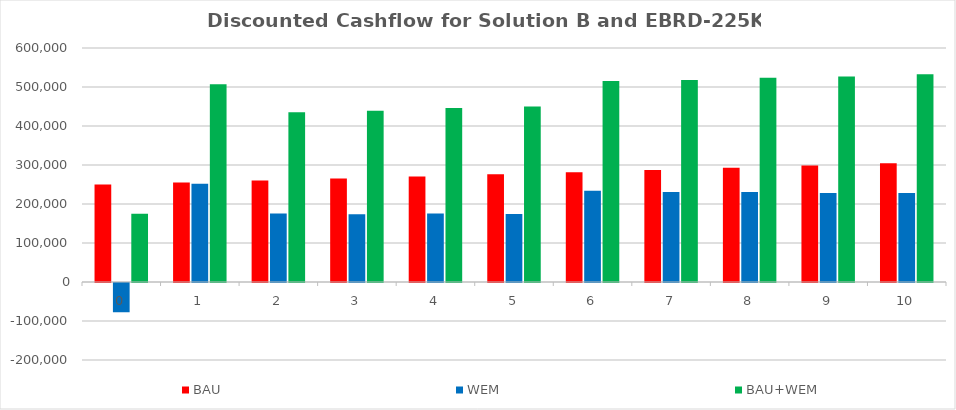
| Category | BAU | WEM | BAU+WEM |
|---|---|---|---|
| 0.0 | 250000 | -75000 | 175000 |
| 1.0 | 255000 | 252073 | 507073 |
| 2.0 | 260100 | 175436 | 435536 |
| 3.0 | 265302 | 174010 | 439312 |
| 4.0 | 270608 | 175547 | 446155 |
| 5.0 | 276020 | 174045 | 450065 |
| 6.0 | 281540 | 234000 | 515540 |
| 7.0 | 287171 | 231000 | 518171 |
| 8.0 | 292914 | 231000 | 523914 |
| 9.0 | 298772 | 228000 | 526772 |
| 10.0 | 304747 | 228000 | 532747 |